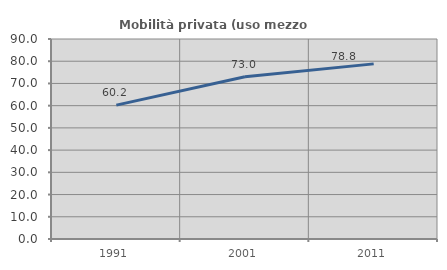
| Category | Mobilità privata (uso mezzo privato) |
|---|---|
| 1991.0 | 60.245 |
| 2001.0 | 72.981 |
| 2011.0 | 78.804 |